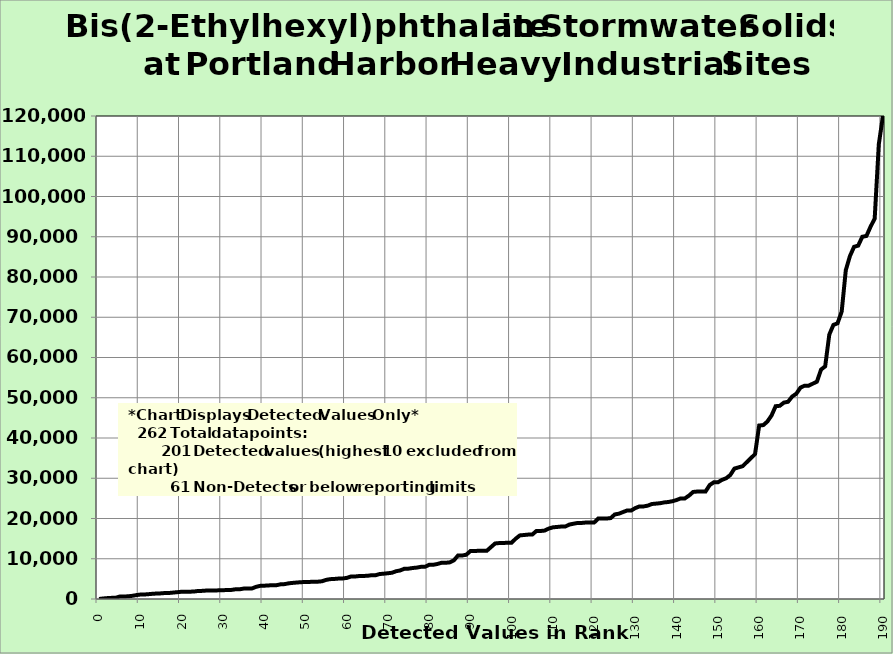
| Category | BEHP |
|---|---|
| 0.0 | 5.39 |
| 1.0 | 130 |
| 2.0 | 220 |
| 3.0 | 280 |
| 4.0 | 299 |
| 5.0 | 605 |
| 6.0 | 620 |
| 7.0 | 670 |
| 8.0 | 782 |
| 9.0 | 960 |
| 10.0 | 1100 |
| 11.0 | 1120 |
| 12.0 | 1200 |
| 13.0 | 1300 |
| 14.0 | 1360 |
| 15.0 | 1400 |
| 16.0 | 1490 |
| 17.0 | 1500 |
| 18.0 | 1600 |
| 19.0 | 1700 |
| 20.0 | 1800 |
| 21.0 | 1800 |
| 22.0 | 1820 |
| 23.0 | 1850 |
| 24.0 | 2000 |
| 25.0 | 2020 |
| 26.0 | 2100 |
| 27.0 | 2100 |
| 28.0 | 2100 |
| 29.0 | 2160 |
| 30.0 | 2200 |
| 31.0 | 2210 |
| 32.0 | 2250 |
| 33.0 | 2400 |
| 34.0 | 2400 |
| 35.0 | 2580 |
| 36.0 | 2600 |
| 37.0 | 2600 |
| 38.0 | 3000 |
| 39.0 | 3260 |
| 40.0 | 3300 |
| 41.0 | 3370 |
| 42.0 | 3420 |
| 43.0 | 3430 |
| 44.0 | 3650 |
| 45.0 | 3700 |
| 46.0 | 3900 |
| 47.0 | 4010 |
| 48.0 | 4100 |
| 49.0 | 4180 |
| 50.0 | 4230 |
| 51.0 | 4240 |
| 52.0 | 4300 |
| 53.0 | 4300 |
| 54.0 | 4400 |
| 55.0 | 4740 |
| 56.0 | 4930 |
| 57.0 | 4980 |
| 58.0 | 5070 |
| 59.0 | 5100 |
| 60.0 | 5230 |
| 61.0 | 5570 |
| 62.0 | 5580 |
| 63.0 | 5700 |
| 64.0 | 5730 |
| 65.0 | 5760 |
| 66.0 | 5900 |
| 67.0 | 5900 |
| 68.0 | 6200 |
| 69.0 | 6290 |
| 70.0 | 6400 |
| 71.0 | 6520 |
| 72.0 | 6900 |
| 73.0 | 7100 |
| 74.0 | 7520 |
| 75.0 | 7540 |
| 76.0 | 7700 |
| 77.0 | 7800 |
| 78.0 | 7990 |
| 79.0 | 8000 |
| 80.0 | 8490 |
| 81.0 | 8500 |
| 82.0 | 8700 |
| 83.0 | 9000 |
| 84.0 | 9000 |
| 85.0 | 9100 |
| 86.0 | 9600 |
| 87.0 | 10800 |
| 88.0 | 10800 |
| 89.0 | 11000 |
| 90.0 | 11900 |
| 91.0 | 11900 |
| 92.0 | 12000 |
| 93.0 | 12000 |
| 94.0 | 12000 |
| 95.0 | 12900 |
| 96.0 | 13800 |
| 97.0 | 13900 |
| 98.0 | 13900 |
| 99.0 | 14000 |
| 100.0 | 14000 |
| 101.0 | 15000 |
| 102.0 | 15800 |
| 103.0 | 15900 |
| 104.0 | 16000 |
| 105.0 | 16000 |
| 106.0 | 16900 |
| 107.0 | 16900 |
| 108.0 | 17000 |
| 109.0 | 17500 |
| 110.0 | 17800 |
| 111.0 | 17900 |
| 112.0 | 18000 |
| 113.0 | 18000 |
| 114.0 | 18500 |
| 115.0 | 18700 |
| 116.0 | 18900 |
| 117.0 | 18900 |
| 118.0 | 19000 |
| 119.0 | 19000 |
| 120.0 | 19000 |
| 121.0 | 20000 |
| 122.0 | 20000 |
| 123.0 | 20000 |
| 124.0 | 20100 |
| 125.0 | 21000 |
| 126.0 | 21200 |
| 127.0 | 21600 |
| 128.0 | 22000 |
| 129.0 | 22000 |
| 130.0 | 22600 |
| 131.0 | 23000 |
| 132.0 | 23000 |
| 133.0 | 23200 |
| 134.0 | 23600 |
| 135.0 | 23700 |
| 136.0 | 23800 |
| 137.0 | 24000 |
| 138.0 | 24100 |
| 139.0 | 24300 |
| 140.0 | 24600 |
| 141.0 | 25000 |
| 142.0 | 25000 |
| 143.0 | 25700 |
| 144.0 | 26600 |
| 145.0 | 26700 |
| 146.0 | 26700 |
| 147.0 | 26700 |
| 148.0 | 28300 |
| 149.0 | 29000 |
| 150.0 | 29000 |
| 151.0 | 29600 |
| 152.0 | 30000 |
| 153.0 | 30800 |
| 154.0 | 32400 |
| 155.0 | 32700 |
| 156.0 | 33000 |
| 157.0 | 34000 |
| 158.0 | 35000 |
| 159.0 | 36000 |
| 160.0 | 43100 |
| 161.0 | 43200 |
| 162.0 | 44100 |
| 163.0 | 45600 |
| 164.0 | 47900 |
| 165.0 | 48000 |
| 166.0 | 48800 |
| 167.0 | 49000 |
| 168.0 | 50300 |
| 169.0 | 51000 |
| 170.0 | 52500 |
| 171.0 | 53000 |
| 172.0 | 53000 |
| 173.0 | 53500 |
| 174.0 | 54000 |
| 175.0 | 57000 |
| 176.0 | 57800 |
| 177.0 | 65700 |
| 178.0 | 68100 |
| 179.0 | 68500 |
| 180.0 | 71400 |
| 181.0 | 81700 |
| 182.0 | 85200 |
| 183.0 | 87500 |
| 184.0 | 87800 |
| 185.0 | 90000 |
| 186.0 | 90200 |
| 187.0 | 92500 |
| 188.0 | 94500 |
| 189.0 | 113000 |
| 190.0 | 120000 |